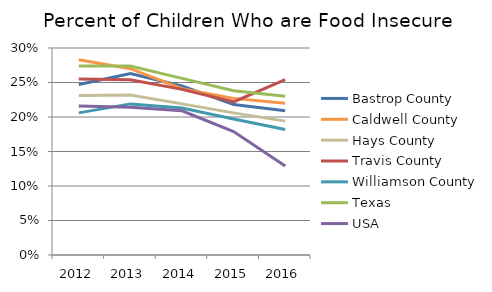
| Category | Bastrop County | Caldwell County | Hays County | Travis County | Williamson County | Texas | USA |
|---|---|---|---|---|---|---|---|
| 2012.0 | 0.247 | 0.283 | 0.231 | 0.255 | 0.206 | 0.274 | 0.216 |
| 2013.0 | 0.263 | 0.27 | 0.232 | 0.254 | 0.219 | 0.274 | 0.214 |
| 2014.0 | 0.245 | 0.241 | 0.219 | 0.24 | 0.213 | 0.256 | 0.209 |
| 2015.0 | 0.218 | 0.227 | 0.206 | 0.222 | 0.197 | 0.238 | 0.179 |
| 2016.0 | 0.209 | 0.22 | 0.194 | 0.254 | 0.182 | 0.23 | 0.129 |